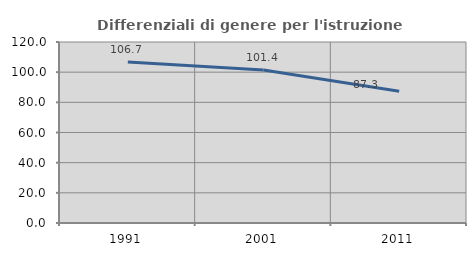
| Category | Differenziali di genere per l'istruzione superiore |
|---|---|
| 1991.0 | 106.737 |
| 2001.0 | 101.402 |
| 2011.0 | 87.287 |